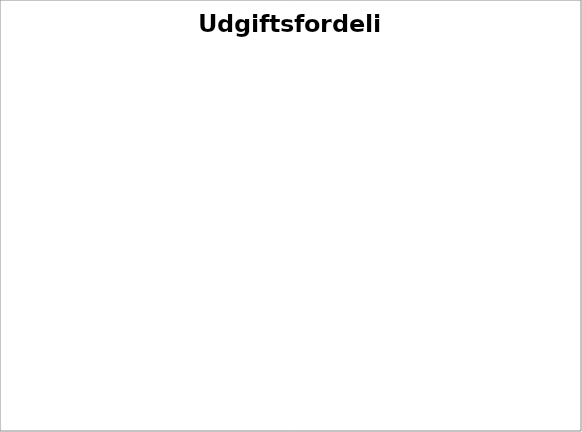
| Category | Series 0 |
|---|---|
| Bolig | 0 |
| Transport | 0 |
| Forsikringer | 0 |
| Medier | 0 |
| Øvrige udgifter | 0 |